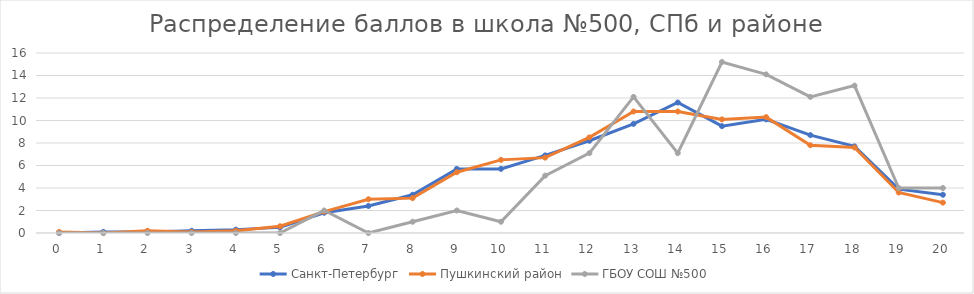
| Category | Санкт-Петербург | Пушкинский район | ГБОУ СОШ №500 |
|---|---|---|---|
| 0.0 | 0 | 0.1 | 0 |
| 1.0 | 0.1 | 0 | 0 |
| 2.0 | 0.1 | 0.2 | 0 |
| 3.0 | 0.2 | 0.1 | 0 |
| 4.0 | 0.3 | 0.2 | 0 |
| 5.0 | 0.5 | 0.6 | 0 |
| 6.0 | 1.8 | 1.9 | 2 |
| 7.0 | 2.4 | 3 | 0 |
| 8.0 | 3.4 | 3.1 | 1 |
| 9.0 | 5.7 | 5.4 | 2 |
| 10.0 | 5.7 | 6.5 | 1 |
| 11.0 | 6.9 | 6.7 | 5.1 |
| 12.0 | 8.2 | 8.5 | 7.1 |
| 13.0 | 9.7 | 10.8 | 12.1 |
| 14.0 | 11.6 | 10.8 | 7.1 |
| 15.0 | 9.5 | 10.1 | 15.2 |
| 16.0 | 10.1 | 10.3 | 14.1 |
| 17.0 | 8.7 | 7.8 | 12.1 |
| 18.0 | 7.7 | 7.6 | 13.1 |
| 19.0 | 3.9 | 3.6 | 4 |
| 20.0 | 3.4 | 2.7 | 4 |